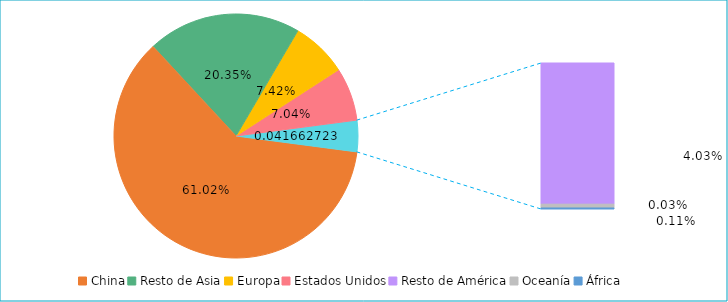
| Category | Series 0 |
|---|---|
| China | 0.61 |
| Resto de Asia | 0.203 |
| Europa | 0.074 |
| Estados Unidos | 0.07 |
| Resto de América | 0.04 |
| Oceanía | 0.001 |
| África | 0 |